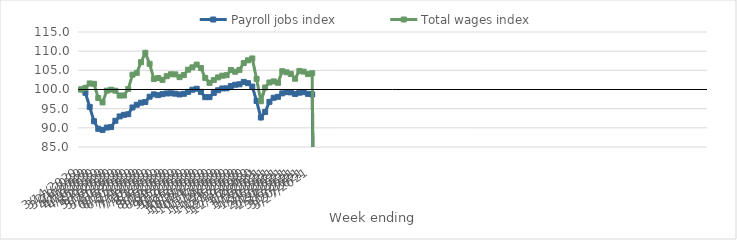
| Category | Payroll jobs index | Total wages index |
|---|---|---|
| 14/03/2020 | 100 | 100 |
| 21/03/2020 | 99.139 | 100.433 |
| 28/03/2020 | 95.456 | 101.581 |
| 04/04/2020 | 91.719 | 101.48 |
| 11/04/2020 | 89.753 | 97.774 |
| 18/04/2020 | 89.463 | 96.628 |
| 25/04/2020 | 90.072 | 99.695 |
| 02/05/2020 | 90.189 | 99.958 |
| 09/05/2020 | 91.835 | 99.702 |
| 16/05/2020 | 92.977 | 98.42 |
| 23/05/2020 | 93.388 | 98.442 |
| 30/05/2020 | 93.554 | 100.114 |
| 06/06/2020 | 95.309 | 103.864 |
| 13/06/2020 | 96.023 | 104.333 |
| 20/06/2020 | 96.561 | 107.122 |
| 27/06/2020 | 96.73 | 109.564 |
| 04/07/2020 | 98.124 | 106.693 |
| 11/07/2020 | 98.74 | 102.756 |
| 18/07/2020 | 98.519 | 102.993 |
| 25/07/2020 | 98.788 | 102.512 |
| 01/08/2020 | 98.972 | 103.47 |
| 08/08/2020 | 99.016 | 103.966 |
| 15/08/2020 | 98.912 | 103.948 |
| 22/08/2020 | 98.71 | 103.227 |
| 29/08/2020 | 98.876 | 103.77 |
| 05/09/2020 | 99.38 | 105.168 |
| 12/09/2020 | 99.942 | 105.784 |
| 19/09/2020 | 100.195 | 106.496 |
| 26/09/2020 | 99.378 | 105.597 |
| 03/10/2020 | 97.993 | 103.023 |
| 10/10/2020 | 98.005 | 101.737 |
| 17/10/2020 | 99.119 | 102.461 |
| 24/10/2020 | 99.806 | 103.162 |
| 31/10/2020 | 100.271 | 103.603 |
| 07/11/2020 | 100.302 | 103.732 |
| 14/11/2020 | 100.908 | 105.073 |
| 21/11/2020 | 101.242 | 104.638 |
| 28/11/2020 | 101.358 | 105.116 |
| 05/12/2020 | 101.977 | 106.901 |
| 12/12/2020 | 101.65 | 107.61 |
| 19/12/2020 | 100.769 | 108.101 |
| 26/12/2020 | 97.011 | 102.753 |
| 02/01/2021 | 92.694 | 96.936 |
| 09/01/2021 | 94.137 | 100.527 |
| 16/01/2021 | 96.781 | 101.832 |
| 23/01/2021 | 97.844 | 102.109 |
| 30/01/2021 | 98.09 | 101.748 |
| 06/02/2021 | 98.993 | 104.768 |
| 13/02/2021 | 99.314 | 104.48 |
| 20/02/2021 | 99.243 | 104.064 |
| 27/02/2021 | 98.838 | 102.819 |
| 06/03/2021 | 99.166 | 104.852 |
| 13/03/2021 | 99.314 | 104.667 |
| 20/03/2021 | 98.861 | 104.022 |
| 27/03/2021 | 98.708 | 104.24 |